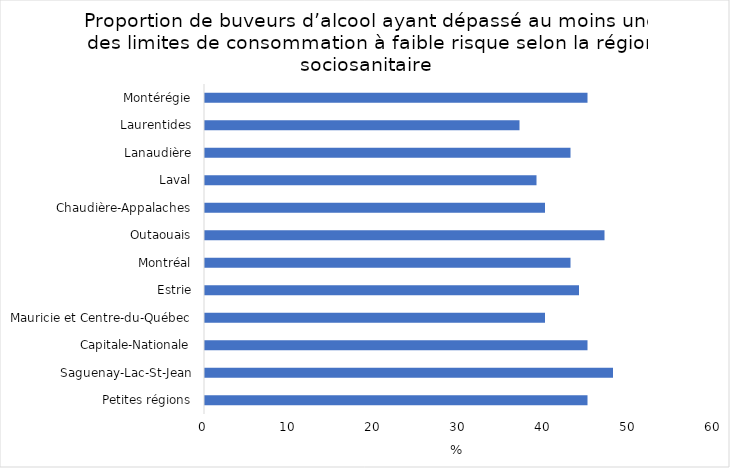
| Category | Series 0 |
|---|---|
| Petites régions | 45 |
| Saguenay-Lac-St-Jean | 48 |
| Capitale-Nationale | 45 |
| Mauricie et Centre-du-Québec | 40 |
| Estrie | 44 |
| Montréal | 43 |
| Outaouais | 47 |
| Chaudière-Appalaches | 40 |
| Laval | 39 |
| Lanaudière | 43 |
| Laurentides | 37 |
| Montérégie | 45 |